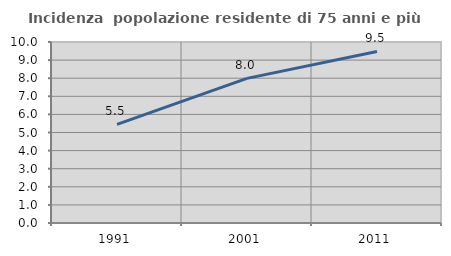
| Category | Incidenza  popolazione residente di 75 anni e più |
|---|---|
| 1991.0 | 5.453 |
| 2001.0 | 7.991 |
| 2011.0 | 9.475 |